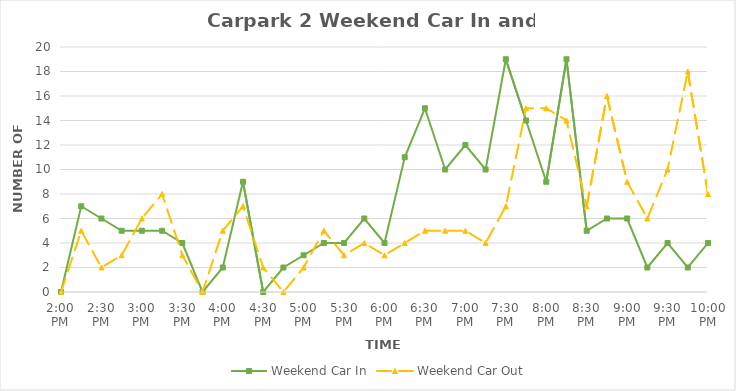
| Category | Weekend Car In | Weekend Car Out |
|---|---|---|
| 0.5833333333333334 | 0 | 0 |
| 0.59375 | 7 | 5 |
| 0.604166666666667 | 6 | 2 |
| 0.614583333333334 | 5 | 3 |
| 0.625 | 5 | 6 |
| 0.635416666666667 | 5 | 8 |
| 0.645833333333334 | 4 | 3 |
| 0.656250000000001 | 0 | 0 |
| 0.666666666666667 | 2 | 5 |
| 0.677083333333334 | 9 | 7 |
| 0.687500000000001 | 0 | 2 |
| 0.697916666666668 | 2 | 0 |
| 0.708333333333335 | 3 | 2 |
| 0.718750000000001 | 4 | 5 |
| 0.729166666666668 | 4 | 3 |
| 0.739583333333335 | 6 | 4 |
| 0.75 | 4 | 3 |
| 0.7604166666666666 | 11 | 4 |
| 0.7708333333333334 | 15 | 5 |
| 0.78125 | 10 | 5 |
| 0.7916666666666666 | 12 | 5 |
| 0.8020833333333334 | 10 | 4 |
| 0.8125 | 19 | 7 |
| 0.8229166666666666 | 14 | 15 |
| 0.8333333333333334 | 9 | 15 |
| 0.84375 | 19 | 14 |
| 0.8541666666666666 | 5 | 7 |
| 0.8645833333333334 | 6 | 16 |
| 0.875 | 6 | 9 |
| 0.8854166666666666 | 2 | 6 |
| 0.8958333333333334 | 4 | 10 |
| 0.90625 | 2 | 18 |
| 0.9166666666666666 | 4 | 8 |